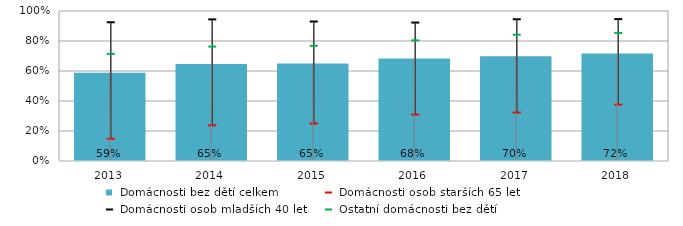
| Category |  Domácnosti bez dětí celkem |
|---|---|
| 2013.0 | 0.588 |
| 2014.0 | 0.647 |
| 2015.0 | 0.651 |
| 2016.0 | 0.684 |
| 2017.0 | 0.699 |
| 2018.0 | 0.716 |